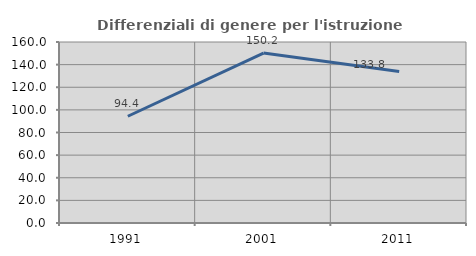
| Category | Differenziali di genere per l'istruzione superiore |
|---|---|
| 1991.0 | 94.364 |
| 2001.0 | 150.201 |
| 2011.0 | 133.835 |